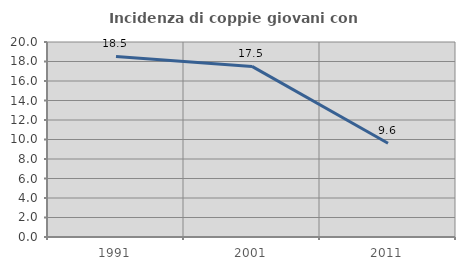
| Category | Incidenza di coppie giovani con figli |
|---|---|
| 1991.0 | 18.519 |
| 2001.0 | 17.498 |
| 2011.0 | 9.617 |